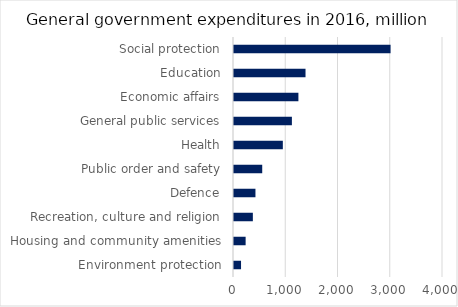
| Category | 2016 |
|---|---|
| Environment protection | 134.7 |
| Housing and community amenities | 222.5 |
| Recreation, culture and religion | 360.9 |
| Defence | 410.6 |
| Public order and safety | 540.2 |
| Health | 934.7 |
| General public services | 1108.1 |
| Economic affairs | 1232.7 |
| Education | 1368.8 |
| Social protection | 2996.5 |